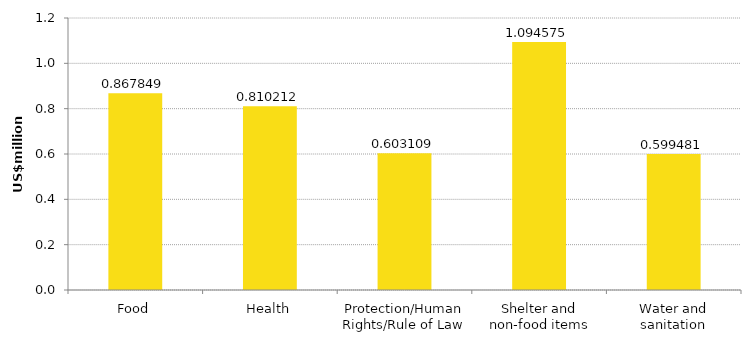
| Category | US$ million |
|---|---|
| Food | 0.868 |
| Health | 0.81 |
| Protection/Human Rights/Rule of Law | 0.603 |
| Shelter and non-food items | 1.095 |
| Water and sanitation | 0.599 |